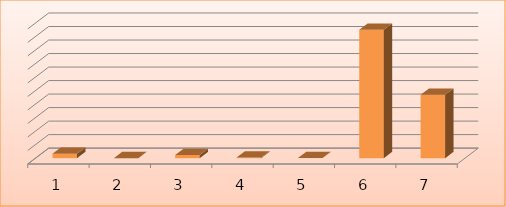
| Category | Series 0 |
|---|---|
| 0 | 648520 |
| 1 | 0 |
| 2 | 468106 |
| 3 | 92758 |
| 4 | 9555 |
| 5 | 18995524 |
| 6 | 9384643 |